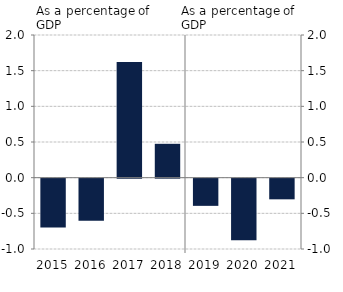
| Category | Fiskális impulzus |
|---|---|
| 2015.0 | -0.685 |
| 2016.0 | -0.59 |
| 2017.0 | 1.621 |
| 2018.0 | 0.475 |
| 2019.0 | -0.381 |
| 2020.0 | -0.863 |
| 2021.0 | -0.29 |